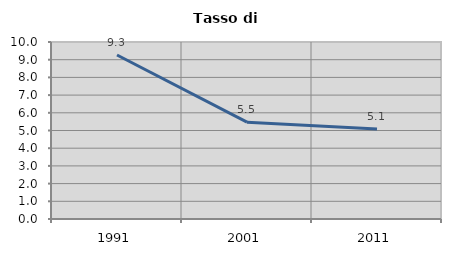
| Category | Tasso di disoccupazione   |
|---|---|
| 1991.0 | 9.264 |
| 2001.0 | 5.472 |
| 2011.0 | 5.081 |